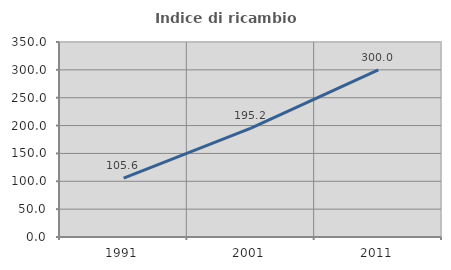
| Category | Indice di ricambio occupazionale  |
|---|---|
| 1991.0 | 105.618 |
| 2001.0 | 195.238 |
| 2011.0 | 300 |